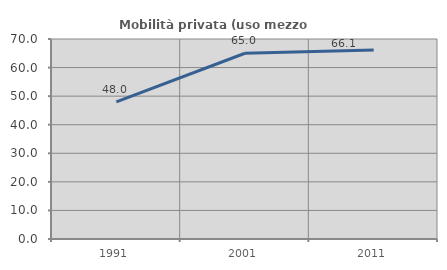
| Category | Mobilità privata (uso mezzo privato) |
|---|---|
| 1991.0 | 48.005 |
| 2001.0 | 65.012 |
| 2011.0 | 66.108 |